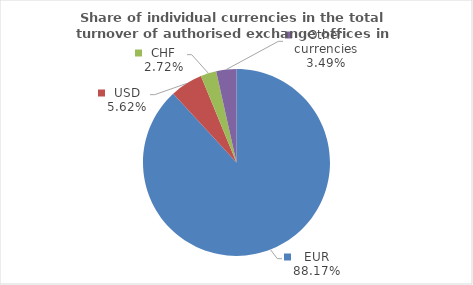
| Category | Series 0 |
|---|---|
| EUR | 88.171 |
| USD | 5.616 |
| CHF | 2.723 |
| Other currencies | 3.49 |